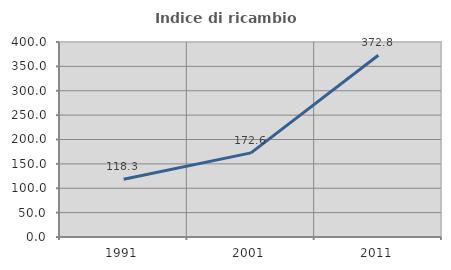
| Category | Indice di ricambio occupazionale  |
|---|---|
| 1991.0 | 118.335 |
| 2001.0 | 172.578 |
| 2011.0 | 372.788 |